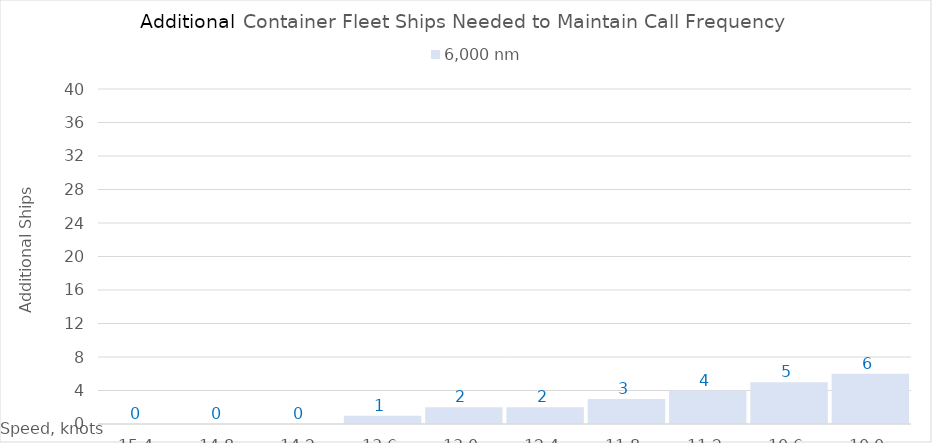
| Category | 6,000 |
|---|---|
| 15.4 | 0 |
| 14.8 | 0 |
| 14.200000000000001 | 0 |
| 13.600000000000001 | 1 |
| 13.000000000000002 | 2 |
| 12.400000000000002 | 2 |
| 11.800000000000002 | 3 |
| 11.200000000000003 | 4 |
| 10.600000000000003 | 5 |
| 10.000000000000004 | 6 |